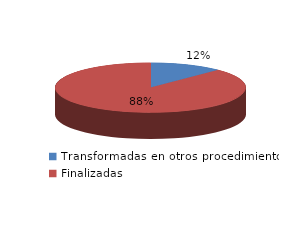
| Category | Series 0 |
|---|---|
| Transformadas en otros procedimientos | 4612 |
| Finalizadas | 32619 |